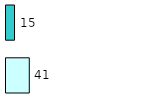
| Category | Series 0 | Series 1 |
|---|---|---|
| 0 | 41 | 15 |